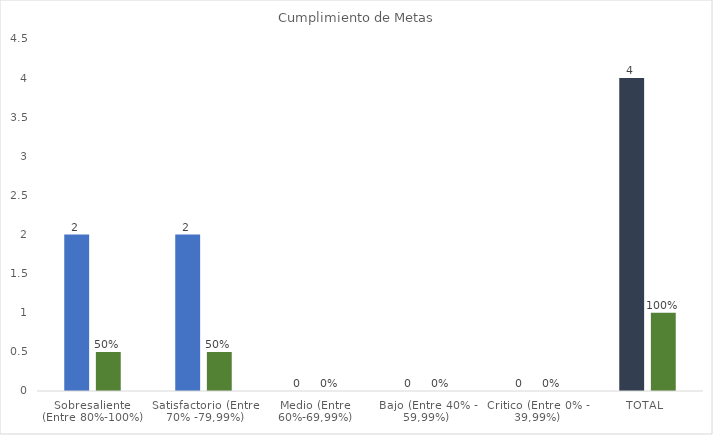
| Category | No. | % |
|---|---|---|
| Sobresaliente  (Entre 80%-100%)  | 2 | 0.5 |
| Satisfactorio (Entre 70% -79,99%) | 2 | 0.5 |
| Medio (Entre 60%-69,99%) | 0 | 0 |
| Bajo (Entre 40% - 59,99%) | 0 | 0 |
| Critico (Entre 0% - 39,99%) | 0 | 0 |
| TOTAL  | 4 | 1 |